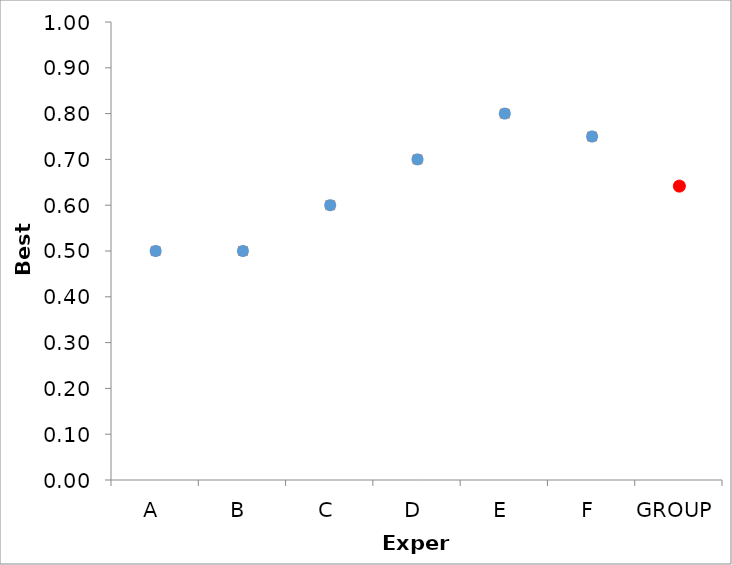
| Category | Series 1 | Series 0 |
|---|---|---|
| A | 0.5 | 0.5 |
| B | 0.5 | 0.5 |
| C | 0.6 | 0.6 |
| D | 0.7 | 0.7 |
| E | 0.8 | 0.8 |
| F | 0.75 | 0.75 |
| GROUP | 0.642 | 0.642 |